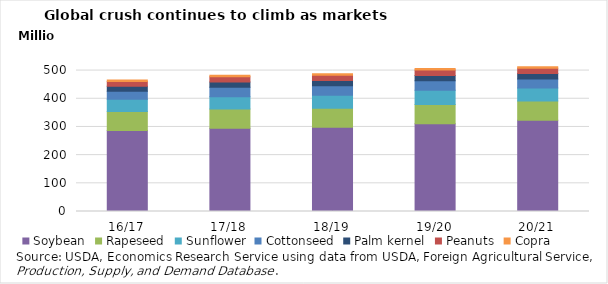
| Category | Soybean | Rapeseed | Sunflower | Cottonseed | Palm kernel | Peanuts | Copra |
|---|---|---|---|---|---|---|---|
| 16/17 | 287551000 | 67326000 | 43126000 | 28837000 | 17168000 | 17538000 | 5428000 |
| 17/18 | 295299000 | 68214000 | 44029000 | 33615000 | 18576000 | 18137000 | 5816000 |
| 18/19 | 298712000 | 67882000 | 46257000 | 32951000 | 19305000 | 18020000 | 5982000 |
| 19/20 | 311260000 | 68340000 | 50219000 | 33907000 | 19199000 | 19016000 | 5733000 |
| 20/21 | 323578000 | 68262000 | 46056000 | 32330000 | 19138000 | 18819000 | 5668000 |